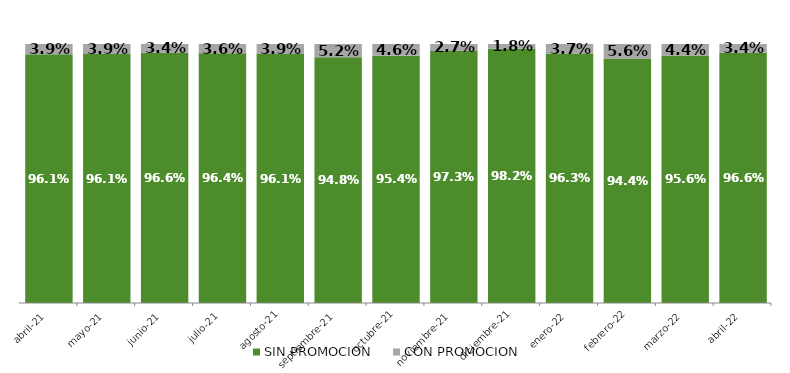
| Category | SIN PROMOCION   | CON PROMOCION   |
|---|---|---|
| 2021-04-01 | 0.961 | 0.039 |
| 2021-05-01 | 0.961 | 0.039 |
| 2021-06-01 | 0.966 | 0.034 |
| 2021-07-01 | 0.964 | 0.036 |
| 2021-08-01 | 0.961 | 0.039 |
| 2021-09-01 | 0.948 | 0.052 |
| 2021-10-01 | 0.954 | 0.046 |
| 2021-11-01 | 0.973 | 0.027 |
| 2021-12-01 | 0.982 | 0.018 |
| 2022-01-01 | 0.963 | 0.037 |
| 2022-02-01 | 0.944 | 0.056 |
| 2022-03-01 | 0.956 | 0.044 |
| 2022-04-01 | 0.966 | 0.034 |